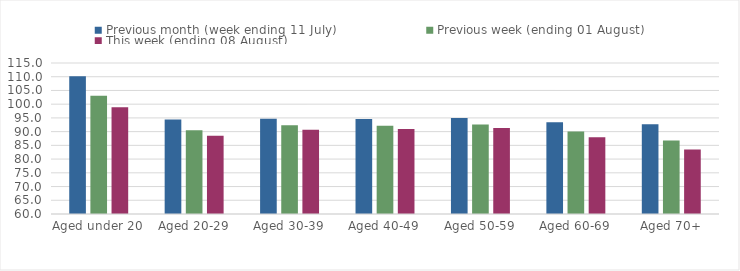
| Category | Previous month (week ending 11 July) | Previous week (ending 01 August) | This week (ending 08 August) |
|---|---|---|---|
| Aged under 20 | 110.185 | 103.037 | 98.868 |
| Aged 20-29 | 94.406 | 90.479 | 88.461 |
| Aged 30-39 | 94.704 | 92.371 | 90.727 |
| Aged 40-49 | 94.56 | 92.182 | 90.963 |
| Aged 50-59 | 94.962 | 92.557 | 91.299 |
| Aged 60-69 | 93.41 | 90.012 | 87.965 |
| Aged 70+ | 92.687 | 86.747 | 83.476 |